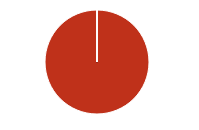
| Category | Total |
|---|---|
| Y | 0 |
| R | 0 |
| T | 0 |
| M | 0 |
| F | 0 |
| N | 245 |